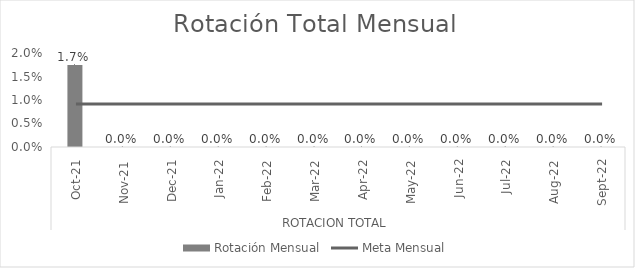
| Category | Series 6 | Rotación Mensual | Series 4 | Series 5 |
|---|---|---|---|---|
| 0 |  | 0.017 |  |  |
| 1 |  | 0 |  |  |
| 2 |  | 0 |  |  |
| 3 |  | 0 |  |  |
| 4 |  | 0 |  |  |
| 5 |  | 0 |  |  |
| 6 |  | 0 |  |  |
| 7 |  | 0 |  |  |
| 8 |  | 0 |  |  |
| 9 |  | 0 |  |  |
| 10 |  | 0 |  |  |
| 11 |  | 0 |  |  |